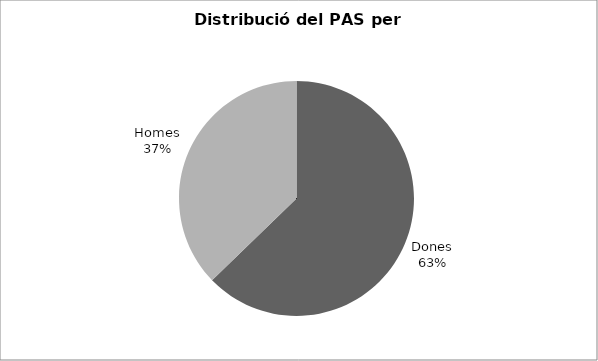
| Category | Series 0 |
|---|---|
| Dones | 922 |
| Homes | 547 |